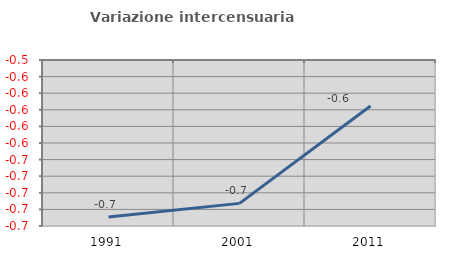
| Category | Variazione intercensuaria annua |
|---|---|
| 1991.0 | -0.729 |
| 2001.0 | -0.713 |
| 2011.0 | -0.595 |